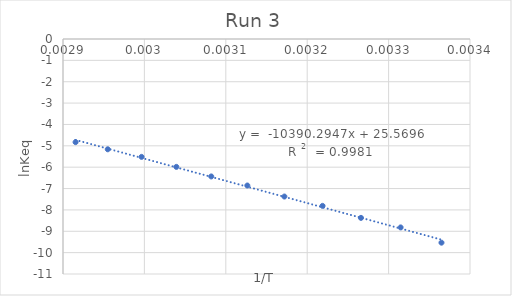
| Category | Series 0 |
|---|---|
| 0.003364963994885255 | -9.533 |
| 0.003314770617873243 | -8.82 |
| 0.0032660526487686982 | -8.373 |
| 0.0032188495831589788 | -7.811 |
| 0.003171985028230667 | -7.374 |
| 0.0031264655307175235 | -6.858 |
| 0.0030821390044691015 | -6.434 |
| 0.0030392365437802026 | -5.986 |
| 0.002996524032122737 | -5.517 |
| 0.002954995419757099 | -5.162 |
| 0.0029154518950437317 | -4.828 |